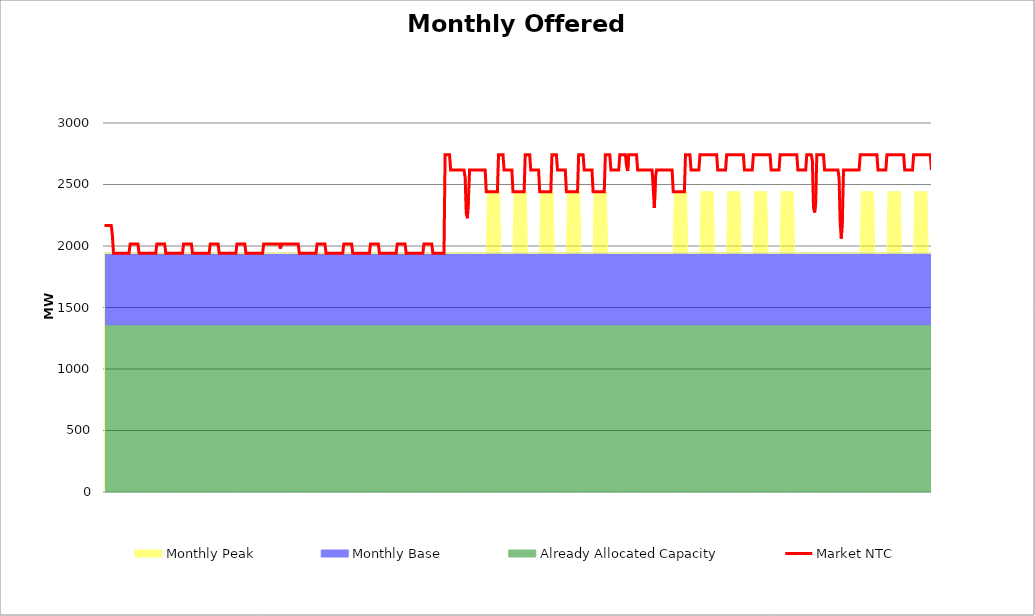
| Category | Market NTC |
|---|---|
| 0 | 2167 |
| 1 | 2167 |
| 2 | 2167 |
| 3 | 2167 |
| 4 | 2167 |
| 5 | 2167 |
| 6 | 2167 |
| 7 | 2092 |
| 8 | 1942 |
| 9 | 1942 |
| 10 | 1942 |
| 11 | 1942 |
| 12 | 1942 |
| 13 | 1942 |
| 14 | 1942 |
| 15 | 1942 |
| 16 | 1942 |
| 17 | 1942 |
| 18 | 1942 |
| 19 | 1942 |
| 20 | 1942 |
| 21 | 1942 |
| 22 | 1942 |
| 23 | 2017 |
| 24 | 2017 |
| 25 | 2017 |
| 26 | 2017 |
| 27 | 2017 |
| 28 | 2017 |
| 29 | 2017 |
| 30 | 2017 |
| 31 | 1942 |
| 32 | 1942 |
| 33 | 1942 |
| 34 | 1942 |
| 35 | 1942 |
| 36 | 1942 |
| 37 | 1942 |
| 38 | 1942 |
| 39 | 1942 |
| 40 | 1942 |
| 41 | 1942 |
| 42 | 1942 |
| 43 | 1942 |
| 44 | 1942 |
| 45 | 1942 |
| 46 | 1942 |
| 47 | 2017 |
| 48 | 2017 |
| 49 | 2017 |
| 50 | 2017 |
| 51 | 2017 |
| 52 | 2017 |
| 53 | 2017 |
| 54 | 2017 |
| 55 | 1942 |
| 56 | 1942 |
| 57 | 1942 |
| 58 | 1942 |
| 59 | 1942 |
| 60 | 1942 |
| 61 | 1942 |
| 62 | 1942 |
| 63 | 1942 |
| 64 | 1942 |
| 65 | 1942 |
| 66 | 1942 |
| 67 | 1942 |
| 68 | 1942 |
| 69 | 1942 |
| 70 | 1942 |
| 71 | 2017 |
| 72 | 2017 |
| 73 | 2017 |
| 74 | 2017 |
| 75 | 2017 |
| 76 | 2017 |
| 77 | 2017 |
| 78 | 2017 |
| 79 | 1942 |
| 80 | 1942 |
| 81 | 1942 |
| 82 | 1942 |
| 83 | 1942 |
| 84 | 1942 |
| 85 | 1942 |
| 86 | 1942 |
| 87 | 1942 |
| 88 | 1942 |
| 89 | 1942 |
| 90 | 1942 |
| 91 | 1942 |
| 92 | 1942 |
| 93 | 1942 |
| 94 | 1942 |
| 95 | 2017 |
| 96 | 2017 |
| 97 | 2017 |
| 98 | 2017 |
| 99 | 2017 |
| 100 | 2017 |
| 101 | 2017 |
| 102 | 2017 |
| 103 | 1942 |
| 104 | 1942 |
| 105 | 1942 |
| 106 | 1942 |
| 107 | 1942 |
| 108 | 1942 |
| 109 | 1942 |
| 110 | 1942 |
| 111 | 1942 |
| 112 | 1942 |
| 113 | 1942 |
| 114 | 1942 |
| 115 | 1942 |
| 116 | 1942 |
| 117 | 1942 |
| 118 | 1942 |
| 119 | 2017 |
| 120 | 2017 |
| 121 | 2017 |
| 122 | 2017 |
| 123 | 2017 |
| 124 | 2017 |
| 125 | 2017 |
| 126 | 2017 |
| 127 | 1942 |
| 128 | 1942 |
| 129 | 1942 |
| 130 | 1942 |
| 131 | 1942 |
| 132 | 1942 |
| 133 | 1942 |
| 134 | 1942 |
| 135 | 1942 |
| 136 | 1942 |
| 137 | 1942 |
| 138 | 1942 |
| 139 | 1942 |
| 140 | 1942 |
| 141 | 1942 |
| 142 | 1942 |
| 143 | 2017 |
| 144 | 2017 |
| 145 | 2017 |
| 146 | 2017 |
| 147 | 2017 |
| 148 | 2017 |
| 149 | 2017 |
| 150 | 2017 |
| 151 | 2017 |
| 152 | 2017 |
| 153 | 2017 |
| 154 | 2017 |
| 155 | 2017 |
| 156 | 2017 |
| 157 | 2017 |
| 158 | 1979 |
| 159 | 2017 |
| 160 | 2017 |
| 161 | 2017 |
| 162 | 2017 |
| 163 | 2017 |
| 164 | 2017 |
| 165 | 2017 |
| 166 | 2017 |
| 167 | 2017 |
| 168 | 2017 |
| 169 | 2017 |
| 170 | 2017 |
| 171 | 2017 |
| 172 | 2017 |
| 173 | 2017 |
| 174 | 2017 |
| 175 | 1942 |
| 176 | 1942 |
| 177 | 1942 |
| 178 | 1942 |
| 179 | 1942 |
| 180 | 1942 |
| 181 | 1942 |
| 182 | 1942 |
| 183 | 1942 |
| 184 | 1942 |
| 185 | 1942 |
| 186 | 1942 |
| 187 | 1942 |
| 188 | 1942 |
| 189 | 1942 |
| 190 | 1942 |
| 191 | 2017 |
| 192 | 2017 |
| 193 | 2017 |
| 194 | 2017 |
| 195 | 2017 |
| 196 | 2017 |
| 197 | 2017 |
| 198 | 2017 |
| 199 | 1942 |
| 200 | 1942 |
| 201 | 1942 |
| 202 | 1942 |
| 203 | 1942 |
| 204 | 1942 |
| 205 | 1942 |
| 206 | 1942 |
| 207 | 1942 |
| 208 | 1942 |
| 209 | 1942 |
| 210 | 1942 |
| 211 | 1942 |
| 212 | 1942 |
| 213 | 1942 |
| 214 | 1942 |
| 215 | 2017 |
| 216 | 2017 |
| 217 | 2017 |
| 218 | 2017 |
| 219 | 2017 |
| 220 | 2017 |
| 221 | 2017 |
| 222 | 2017 |
| 223 | 1942 |
| 224 | 1942 |
| 225 | 1942 |
| 226 | 1942 |
| 227 | 1942 |
| 228 | 1942 |
| 229 | 1942 |
| 230 | 1942 |
| 231 | 1942 |
| 232 | 1942 |
| 233 | 1942 |
| 234 | 1942 |
| 235 | 1942 |
| 236 | 1942 |
| 237 | 1942 |
| 238 | 1942 |
| 239 | 2017 |
| 240 | 2017 |
| 241 | 2017 |
| 242 | 2017 |
| 243 | 2017 |
| 244 | 2017 |
| 245 | 2017 |
| 246 | 2017 |
| 247 | 1942 |
| 248 | 1942 |
| 249 | 1942 |
| 250 | 1942 |
| 251 | 1942 |
| 252 | 1942 |
| 253 | 1942 |
| 254 | 1942 |
| 255 | 1942 |
| 256 | 1942 |
| 257 | 1942 |
| 258 | 1942 |
| 259 | 1942 |
| 260 | 1942 |
| 261 | 1942 |
| 262 | 1942 |
| 263 | 2017 |
| 264 | 2017 |
| 265 | 2017 |
| 266 | 2017 |
| 267 | 2017 |
| 268 | 2017 |
| 269 | 2017 |
| 270 | 2017 |
| 271 | 1942 |
| 272 | 1942 |
| 273 | 1942 |
| 274 | 1942 |
| 275 | 1942 |
| 276 | 1942 |
| 277 | 1942 |
| 278 | 1942 |
| 279 | 1942 |
| 280 | 1942 |
| 281 | 1942 |
| 282 | 1942 |
| 283 | 1942 |
| 284 | 1942 |
| 285 | 1942 |
| 286 | 1942 |
| 287 | 2017 |
| 288 | 2017 |
| 289 | 2017 |
| 290 | 2017 |
| 291 | 2017 |
| 292 | 2017 |
| 293 | 2017 |
| 294 | 2017 |
| 295 | 1942 |
| 296 | 1942 |
| 297 | 1942 |
| 298 | 1942 |
| 299 | 1942 |
| 300 | 1942 |
| 301 | 1942 |
| 302 | 1942 |
| 303 | 1942 |
| 304 | 1942 |
| 305 | 1942 |
| 306 | 2742 |
| 307 | 2742 |
| 308 | 2742 |
| 309 | 2742 |
| 310 | 2742 |
| 311 | 2617 |
| 312 | 2617 |
| 313 | 2617 |
| 314 | 2617 |
| 315 | 2617 |
| 316 | 2617 |
| 317 | 2617 |
| 318 | 2617 |
| 319 | 2617 |
| 320 | 2617 |
| 321 | 2617 |
| 322 | 2617 |
| 323 | 2617 |
| 324 | 2556 |
| 325 | 2268 |
| 326 | 2226 |
| 327 | 2391 |
| 328 | 2617 |
| 329 | 2617 |
| 330 | 2617 |
| 331 | 2617 |
| 332 | 2617 |
| 333 | 2617 |
| 334 | 2617 |
| 335 | 2617 |
| 336 | 2617 |
| 337 | 2617 |
| 338 | 2617 |
| 339 | 2617 |
| 340 | 2617 |
| 341 | 2617 |
| 342 | 2617 |
| 343 | 2442 |
| 344 | 2442 |
| 345 | 2442 |
| 346 | 2442 |
| 347 | 2442 |
| 348 | 2442 |
| 349 | 2442 |
| 350 | 2442 |
| 351 | 2442 |
| 352 | 2442 |
| 353 | 2442 |
| 354 | 2742 |
| 355 | 2742 |
| 356 | 2742 |
| 357 | 2742 |
| 358 | 2742 |
| 359 | 2617 |
| 360 | 2617 |
| 361 | 2617 |
| 362 | 2617 |
| 363 | 2617 |
| 364 | 2617 |
| 365 | 2617 |
| 366 | 2617 |
| 367 | 2442 |
| 368 | 2442 |
| 369 | 2442 |
| 370 | 2442 |
| 371 | 2442 |
| 372 | 2442 |
| 373 | 2442 |
| 374 | 2442 |
| 375 | 2442 |
| 376 | 2442 |
| 377 | 2442 |
| 378 | 2742 |
| 379 | 2742 |
| 380 | 2742 |
| 381 | 2742 |
| 382 | 2742 |
| 383 | 2617 |
| 384 | 2617 |
| 385 | 2617 |
| 386 | 2617 |
| 387 | 2617 |
| 388 | 2617 |
| 389 | 2617 |
| 390 | 2617 |
| 391 | 2442 |
| 392 | 2442 |
| 393 | 2442 |
| 394 | 2442 |
| 395 | 2442 |
| 396 | 2442 |
| 397 | 2442 |
| 398 | 2442 |
| 399 | 2442 |
| 400 | 2442 |
| 401 | 2442 |
| 402 | 2742 |
| 403 | 2742 |
| 404 | 2742 |
| 405 | 2742 |
| 406 | 2742 |
| 407 | 2617 |
| 408 | 2617 |
| 409 | 2617 |
| 410 | 2617 |
| 411 | 2617 |
| 412 | 2617 |
| 413 | 2617 |
| 414 | 2617 |
| 415 | 2442 |
| 416 | 2442 |
| 417 | 2442 |
| 418 | 2442 |
| 419 | 2442 |
| 420 | 2442 |
| 421 | 2442 |
| 422 | 2442 |
| 423 | 2442 |
| 424 | 2442 |
| 425 | 2442 |
| 426 | 2742 |
| 427 | 2742 |
| 428 | 2742 |
| 429 | 2742 |
| 430 | 2742 |
| 431 | 2617 |
| 432 | 2617 |
| 433 | 2617 |
| 434 | 2617 |
| 435 | 2617 |
| 436 | 2617 |
| 437 | 2617 |
| 438 | 2617 |
| 439 | 2442 |
| 440 | 2442 |
| 441 | 2442 |
| 442 | 2442 |
| 443 | 2442 |
| 444 | 2442 |
| 445 | 2442 |
| 446 | 2442 |
| 447 | 2442 |
| 448 | 2442 |
| 449 | 2442 |
| 450 | 2742 |
| 451 | 2742 |
| 452 | 2742 |
| 453 | 2742 |
| 454 | 2742 |
| 455 | 2617 |
| 456 | 2617 |
| 457 | 2617 |
| 458 | 2617 |
| 459 | 2617 |
| 460 | 2617 |
| 461 | 2617 |
| 462 | 2617 |
| 463 | 2742 |
| 464 | 2742 |
| 465 | 2742 |
| 466 | 2742 |
| 467 | 2742 |
| 468 | 2742 |
| 469 | 2652 |
| 470 | 2610 |
| 471 | 2742 |
| 472 | 2742 |
| 473 | 2742 |
| 474 | 2742 |
| 475 | 2742 |
| 476 | 2742 |
| 477 | 2742 |
| 478 | 2742 |
| 479 | 2617 |
| 480 | 2617 |
| 481 | 2617 |
| 482 | 2617 |
| 483 | 2617 |
| 484 | 2617 |
| 485 | 2617 |
| 486 | 2617 |
| 487 | 2617 |
| 488 | 2617 |
| 489 | 2617 |
| 490 | 2617 |
| 491 | 2617 |
| 492 | 2617 |
| 493 | 2474 |
| 494 | 2309 |
| 495 | 2556 |
| 496 | 2617 |
| 497 | 2617 |
| 498 | 2617 |
| 499 | 2617 |
| 500 | 2617 |
| 501 | 2617 |
| 502 | 2617 |
| 503 | 2617 |
| 504 | 2617 |
| 505 | 2617 |
| 506 | 2617 |
| 507 | 2617 |
| 508 | 2617 |
| 509 | 2617 |
| 510 | 2617 |
| 511 | 2442 |
| 512 | 2442 |
| 513 | 2442 |
| 514 | 2442 |
| 515 | 2442 |
| 516 | 2442 |
| 517 | 2442 |
| 518 | 2442 |
| 519 | 2442 |
| 520 | 2442 |
| 521 | 2442 |
| 522 | 2742 |
| 523 | 2742 |
| 524 | 2742 |
| 525 | 2742 |
| 526 | 2742 |
| 527 | 2617 |
| 528 | 2617 |
| 529 | 2617 |
| 530 | 2617 |
| 531 | 2617 |
| 532 | 2617 |
| 533 | 2617 |
| 534 | 2617 |
| 535 | 2742 |
| 536 | 2742 |
| 537 | 2742 |
| 538 | 2742 |
| 539 | 2742 |
| 540 | 2742 |
| 541 | 2742 |
| 542 | 2742 |
| 543 | 2742 |
| 544 | 2742 |
| 545 | 2742 |
| 546 | 2742 |
| 547 | 2742 |
| 548 | 2742 |
| 549 | 2742 |
| 550 | 2742 |
| 551 | 2617 |
| 552 | 2617 |
| 553 | 2617 |
| 554 | 2617 |
| 555 | 2617 |
| 556 | 2617 |
| 557 | 2617 |
| 558 | 2617 |
| 559 | 2742 |
| 560 | 2742 |
| 561 | 2742 |
| 562 | 2742 |
| 563 | 2742 |
| 564 | 2742 |
| 565 | 2742 |
| 566 | 2742 |
| 567 | 2742 |
| 568 | 2742 |
| 569 | 2742 |
| 570 | 2742 |
| 571 | 2742 |
| 572 | 2742 |
| 573 | 2742 |
| 574 | 2742 |
| 575 | 2617 |
| 576 | 2617 |
| 577 | 2617 |
| 578 | 2617 |
| 579 | 2617 |
| 580 | 2617 |
| 581 | 2617 |
| 582 | 2617 |
| 583 | 2742 |
| 584 | 2742 |
| 585 | 2742 |
| 586 | 2742 |
| 587 | 2742 |
| 588 | 2742 |
| 589 | 2742 |
| 590 | 2742 |
| 591 | 2742 |
| 592 | 2742 |
| 593 | 2742 |
| 594 | 2742 |
| 595 | 2742 |
| 596 | 2742 |
| 597 | 2742 |
| 598 | 2742 |
| 599 | 2617 |
| 600 | 2617 |
| 601 | 2617 |
| 602 | 2617 |
| 603 | 2617 |
| 604 | 2617 |
| 605 | 2617 |
| 606 | 2617 |
| 607 | 2742 |
| 608 | 2742 |
| 609 | 2742 |
| 610 | 2742 |
| 611 | 2742 |
| 612 | 2742 |
| 613 | 2742 |
| 614 | 2742 |
| 615 | 2742 |
| 616 | 2742 |
| 617 | 2742 |
| 618 | 2742 |
| 619 | 2742 |
| 620 | 2742 |
| 621 | 2742 |
| 622 | 2742 |
| 623 | 2617 |
| 624 | 2617 |
| 625 | 2617 |
| 626 | 2617 |
| 627 | 2617 |
| 628 | 2617 |
| 629 | 2617 |
| 630 | 2617 |
| 631 | 2742 |
| 632 | 2742 |
| 633 | 2742 |
| 634 | 2742 |
| 635 | 2742 |
| 636 | 2694 |
| 637 | 2315 |
| 638 | 2273 |
| 639 | 2358 |
| 640 | 2742 |
| 641 | 2742 |
| 642 | 2742 |
| 643 | 2742 |
| 644 | 2742 |
| 645 | 2742 |
| 646 | 2742 |
| 647 | 2617 |
| 648 | 2617 |
| 649 | 2617 |
| 650 | 2617 |
| 651 | 2617 |
| 652 | 2617 |
| 653 | 2617 |
| 654 | 2617 |
| 655 | 2617 |
| 656 | 2617 |
| 657 | 2617 |
| 658 | 2617 |
| 659 | 2617 |
| 660 | 2556 |
| 661 | 2185 |
| 662 | 2061 |
| 663 | 2226 |
| 664 | 2617 |
| 665 | 2617 |
| 666 | 2617 |
| 667 | 2617 |
| 668 | 2617 |
| 669 | 2617 |
| 670 | 2617 |
| 671 | 2617 |
| 672 | 2617 |
| 673 | 2617 |
| 674 | 2617 |
| 675 | 2617 |
| 676 | 2617 |
| 677 | 2617 |
| 678 | 2617 |
| 679 | 2742 |
| 680 | 2742 |
| 681 | 2742 |
| 682 | 2742 |
| 683 | 2742 |
| 684 | 2742 |
| 685 | 2742 |
| 686 | 2742 |
| 687 | 2742 |
| 688 | 2742 |
| 689 | 2742 |
| 690 | 2742 |
| 691 | 2742 |
| 692 | 2742 |
| 693 | 2742 |
| 694 | 2742 |
| 695 | 2617 |
| 696 | 2617 |
| 697 | 2617 |
| 698 | 2617 |
| 699 | 2617 |
| 700 | 2617 |
| 701 | 2617 |
| 702 | 2617 |
| 703 | 2742 |
| 704 | 2742 |
| 705 | 2742 |
| 706 | 2742 |
| 707 | 2742 |
| 708 | 2742 |
| 709 | 2742 |
| 710 | 2742 |
| 711 | 2742 |
| 712 | 2742 |
| 713 | 2742 |
| 714 | 2742 |
| 715 | 2742 |
| 716 | 2742 |
| 717 | 2742 |
| 718 | 2742 |
| 719 | 2617 |
| 720 | 2617 |
| 721 | 2617 |
| 722 | 2617 |
| 723 | 2617 |
| 724 | 2617 |
| 725 | 2617 |
| 726 | 2617 |
| 727 | 2742 |
| 728 | 2742 |
| 729 | 2742 |
| 730 | 2742 |
| 731 | 2742 |
| 732 | 2742 |
| 733 | 2742 |
| 734 | 2742 |
| 735 | 2742 |
| 736 | 2742 |
| 737 | 2742 |
| 738 | 2742 |
| 739 | 2742 |
| 740 | 2742 |
| 741 | 2742 |
| 742 | 2742 |
| 743 | 2617 |